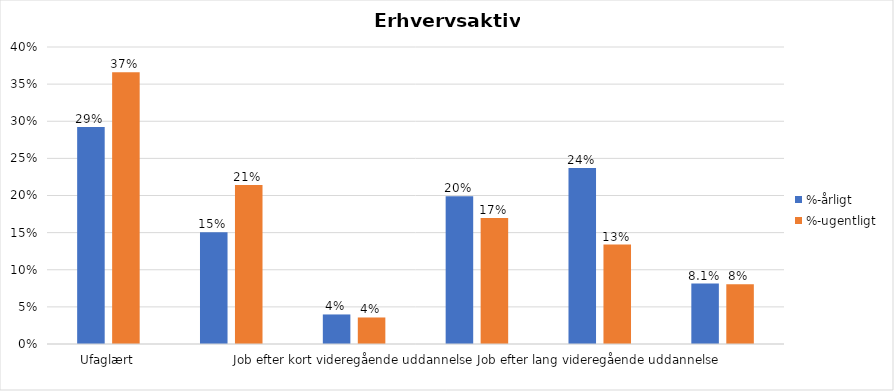
| Category | %-årligt | %-ugentligt |
|---|---|---|
| Ufaglært | 0.292 | 0.366 |
| Erhvervsfagligt job | 0.151 | 0.214 |
| Job efter kort videregående uddannelse | 0.04 | 0.036 |
| Job efter mellemlang videregående uddannelse | 0.199 | 0.17 |
| Job efter lang videregående uddannelse | 0.237 | 0.134 |
| Selvstændig | 0.081 | 0.08 |